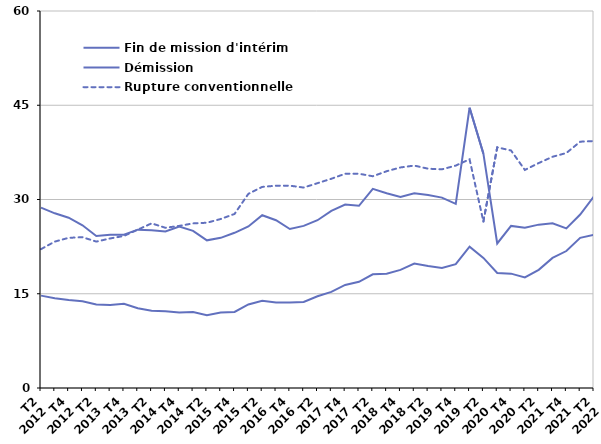
| Category | Fin de mission d'intérim | Démission | Rupture conventionnelle |
|---|---|---|---|
| T2
2012 | 28.7 | 14.7 | 22.1 |
| T3
2012 | 27.8 | 14.3 | 23.3 |
| T4
2012 | 27.1 | 14 | 23.9 |
| T1
2013 | 25.9 | 13.8 | 24 |
| T2
2013 | 24.2 | 13.3 | 23.3 |
| T3
2013 | 24.4 | 13.2 | 23.8 |
| T4
2013 | 24.4 | 13.4 | 24.2 |
| T1
2014 | 25.2 | 12.7 | 25.2 |
| T2
2014 | 25.1 | 12.3 | 26.2 |
| T3
2014 | 24.9 | 12.2 | 25.5 |
| T4
2014 | 25.7 | 12 | 25.8 |
| T1
2015 | 25 | 12.1 | 26.2 |
| T2
2015 | 23.5 | 11.6 | 26.3 |
| T3
2015 | 23.9 | 12 | 26.9 |
| T4
2015 | 24.7 | 12.1 | 27.7 |
| T1
2016 | 25.7 | 13.3 | 30.9 |
| T2
2016 | 27.5 | 13.9 | 32 |
| T3
2016 | 26.7 | 13.6 | 32.2 |
| T4
2016 | 25.3 | 13.6 | 32.2 |
| T1
2017 | 25.8 | 13.7 | 31.9 |
| T2
2017 | 26.7 | 14.6 | 32.6 |
| T3
2017 | 28.2 | 15.3 | 33.3 |
| T4
2017 | 29.2 | 16.4 | 34.1 |
| T1
2018 | 29 | 16.9 | 34.1 |
| T2
2018 | 31.7 | 18.1 | 33.7 |
| T3
2018 | 31 | 18.2 | 34.5 |
| T4
2018 | 30.4 | 18.8 | 35.1 |
| T1
2019 | 31 | 19.8 | 35.4 |
| T2
2019 | 30.7 | 19.4 | 34.9 |
| T3
2019 | 30.3 | 19.1 | 34.8 |
| T4
2019 | 29.3 | 19.7 | 35.4 |
| T1
2020 | 44.6 | 22.5 | 36.4 |
| T2
2020 | 37.3 | 20.7 | 26.5 |
| T3
2020 | 23 | 18.3 | 38.3 |
| T4
2020 | 25.8 | 18.2 | 37.8 |
| T1
2021 | 25.5 | 17.6 | 34.7 |
| T2
2021 | 26 | 18.8 | 35.8 |
| T3
2021 | 26.2 | 20.7 | 36.8 |
| T4
2021 | 25.4 | 21.8 | 37.4 |
| T1
2022 | 27.6 | 23.9 | 39.2 |
| T2
2022 | 30.5 | 24.4 | 39.3 |